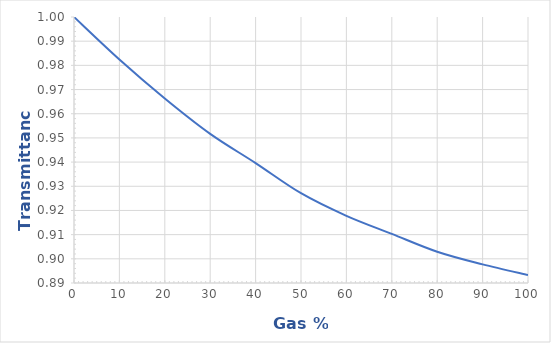
| Category | Series 0 |
|---|---|
| 0.0 | 1 |
| 10.0 | 0.982 |
| 20.0 | 0.966 |
| 30.0 | 0.952 |
| 40.0 | 0.94 |
| 50.0 | 0.927 |
| 60.0 | 0.918 |
| 70.0 | 0.91 |
| 80.0 | 0.903 |
| 90.0 | 0.898 |
| 100.0 | 0.893 |